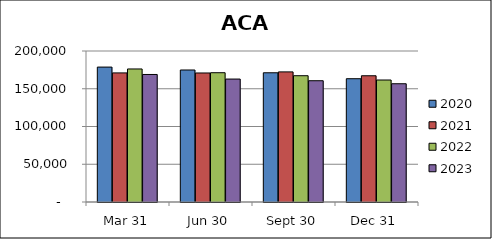
| Category | 2020 | 2021 | 2022 | 2023 |
|---|---|---|---|---|
| Mar 31 | 178696 | 170986 | 176211 | 168896 |
| Jun 30 | 174851 | 170896 | 171237 | 162832 |
| Sept 30 | 171164 | 172345 | 167270 | 160626 |
| Dec 31 | 163305 | 167215 | 161581 | 156639 |